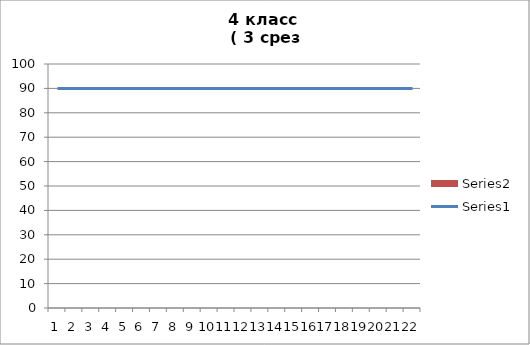
| Category | Series 1 |
|---|---|
| 0 | 0 |
| 1 | 0 |
| 2 | 0 |
| 3 | 0 |
| 4 | 0 |
| 5 | 0 |
| 6 | 0 |
| 7 | 0 |
| 8 | 0 |
| 9 | 0 |
| 10 | 0 |
| 11 | 0 |
| 12 | 0 |
| 13 | 0 |
| 14 | 0 |
| 15 | 0 |
| 16 | 0 |
| 17 | 0 |
| 18 | 0 |
| 19 | 0 |
| 20 | 0 |
| 21 | 0 |